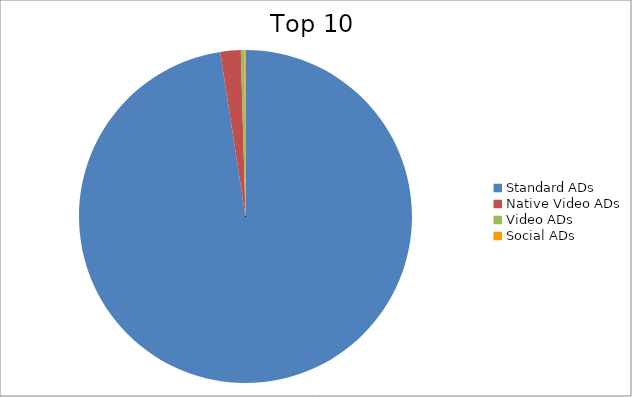
| Category | Series 0 |
|---|---|
| Standard ADs | 97.57 |
| Native Video ADs | 1.98 |
| Video ADs | 0.35 |
| Social ADs | 0.1 |